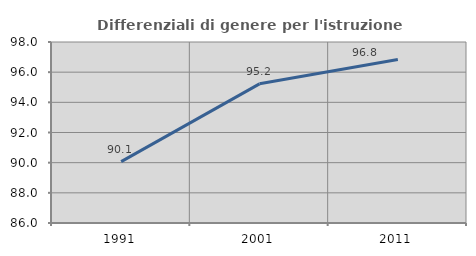
| Category | Differenziali di genere per l'istruzione superiore |
|---|---|
| 1991.0 | 90.068 |
| 2001.0 | 95.226 |
| 2011.0 | 96.84 |